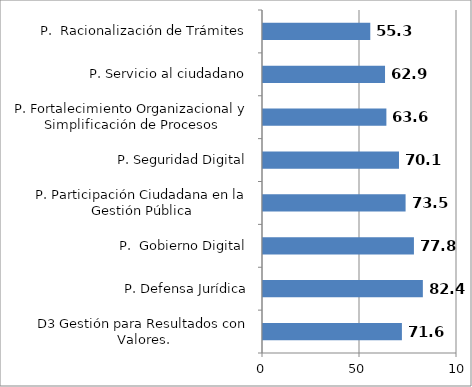
| Category | Series 0 |
|---|---|
| D3 Gestión para Resultados con Valores. | 71.6 |
| P. Defensa Jurídica | 82.4 |
| P.  Gobierno Digital | 77.8 |
| P. Participación Ciudadana en la Gestión Pública | 73.5 |
| P. Seguridad Digital | 70.1 |
| P. Fortalecimiento Organizacional y Simplificación de Procesos | 63.6 |
| P. Servicio al ciudadano | 62.9 |
| P.  Racionalización de Trámites | 55.3 |